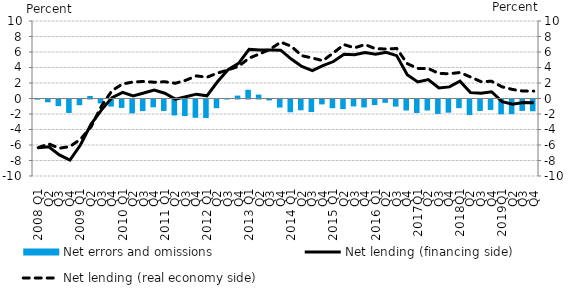
| Category | Net errors and omissions |
|---|---|
| 2008 Q1 | -0.014 |
| Q2 | -0.362 |
| Q3 | -0.855 |
| Q4 | -1.737 |
| 2009 Q1 | -0.734 |
| Q2 | 0.322 |
| Q3 | -0.503 |
| Q4 | -0.912 |
| 2010 Q1 | -1.084 |
| Q2 | -1.79 |
| Q3 | -1.496 |
| Q4 | -1.003 |
| 2011 Q1 | -1.476 |
| Q2 | -2.055 |
| Q3 | -2.135 |
| Q4 | -2.36 |
| 2012 Q1 | -2.393 |
| Q2 | -1.123 |
| Q3 | 0.036 |
| Q4 | 0.377 |
| 2013 Q1 | 1.127 |
| Q2 | 0.504 |
| Q3 | -0.116 |
| Q4 | -1.041 |
| 2014 Q1 | -1.648 |
| Q2 | -1.391 |
| Q3 | -1.619 |
| Q4 | -0.633 |
| 2015 Q1 | -1.121 |
| Q2 | -1.236 |
| Q3 | -0.892 |
| Q4 | -1.025 |
| 2016 Q1 | -0.719 |
| Q2 | -0.431 |
| Q3 | -0.915 |
| Q4 | -1.422 |
| 2017Q1 | -1.745 |
| Q2 | -1.42 |
| Q3 | -1.859 |
| Q4 | -1.698 |
| 2018Q1 | -1.115 |
| Q2 | -2.009 |
| Q3 | -1.486 |
| Q4 | -1.351 |
| 2019Q1 | -1.911 |
| Q2 | -1.887 |
| Q3 | -1.474 |
| Q4 | -1.517 |